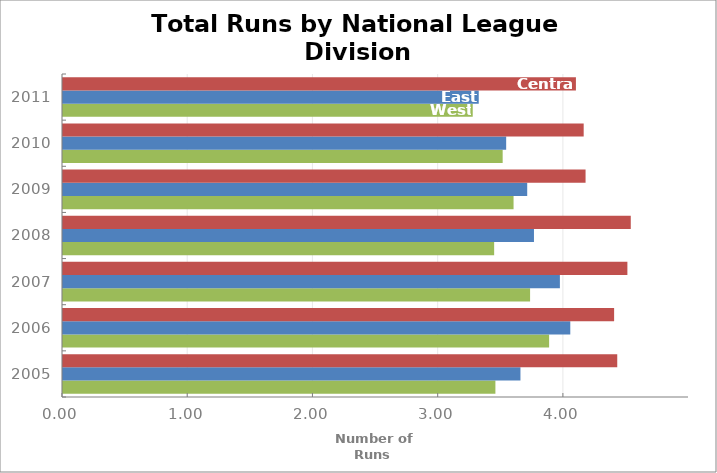
| Category | West | East | Central |
|---|---|---|---|
| 2005.0 | 3454 | 3654 | 4427 |
| 2006.0 | 3883 | 4052 | 4402 |
| 2007.0 | 3731 | 3969 | 4508 |
| 2008.0 | 3444 | 3762 | 4535 |
| 2009.0 | 3599 | 3708 | 4174 |
| 2010.0 | 3512 | 3540 | 4159 |
| 2011.0 | 3273 | 3321 | 4097 |